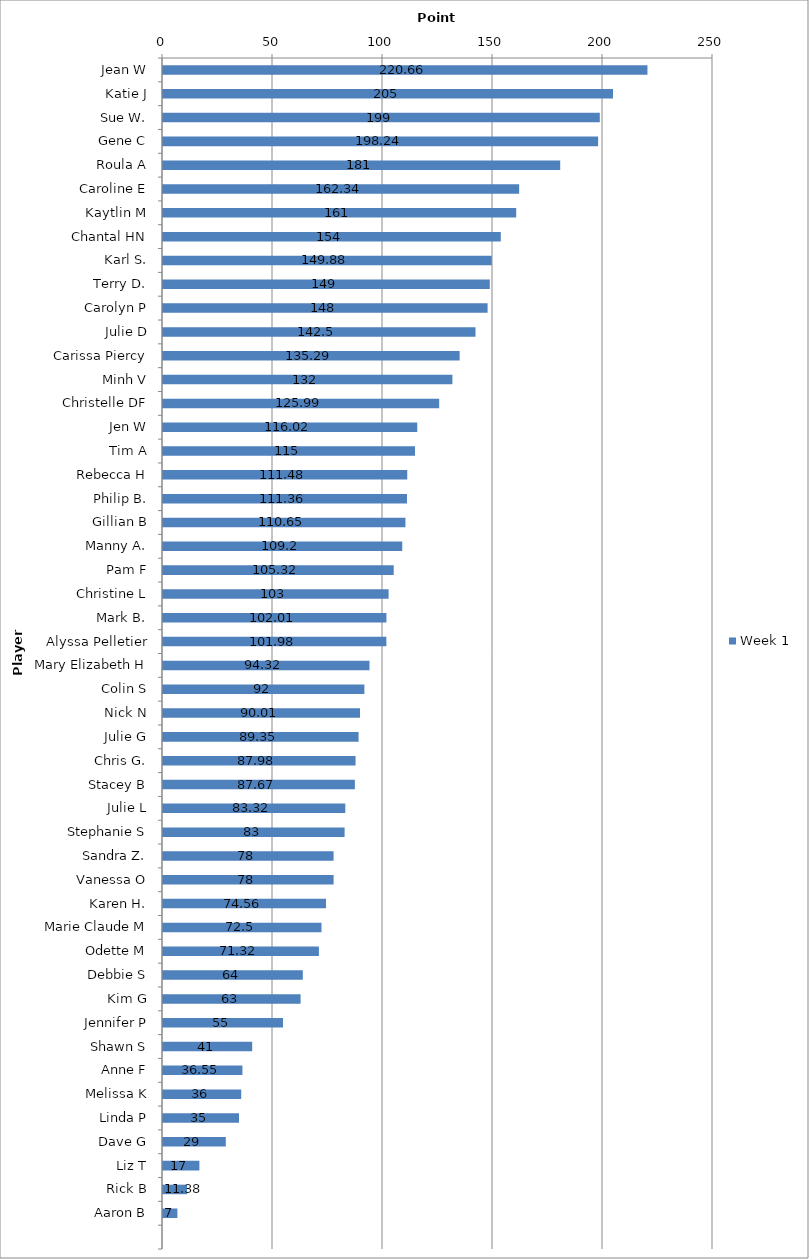
| Category | Week 1 |
|---|---|
| Jean W | 220.66 |
| Katie J | 205 |
| Sue W. | 199 |
| Gene C | 198.24 |
| Roula A | 181 |
| Caroline E | 162.34 |
| Kaytlin M | 161 |
| Chantal HN | 154 |
| Karl S. | 149.88 |
| Terry D. | 149 |
| Carolyn P | 148 |
| Julie D | 142.5 |
| Carissa Piercy | 135.29 |
| Minh V | 132 |
| Christelle DF | 125.99 |
| Jen W | 116.02 |
| Tim A | 115 |
| Rebecca H | 111.48 |
| Philip B. | 111.36 |
| Gillian B | 110.65 |
| Manny A. | 109.2 |
| Pam F | 105.32 |
| Christine L | 103 |
| Mark B. | 102.01 |
| Alyssa Pelletier | 101.98 |
| Mary Elizabeth H | 94.32 |
| Colin S | 92 |
| Nick N | 90.01 |
| Julie G | 89.35 |
| Chris G. | 87.98 |
| Stacey B | 87.67 |
| Julie L | 83.32 |
| Stephanie S | 83 |
| Sandra Z. | 78 |
| Vanessa O | 78 |
| Karen H. | 74.56 |
| Marie Claude M | 72.5 |
| Odette M | 71.32 |
| Debbie S | 64 |
| Kim G | 63 |
| Jennifer P | 55 |
| Shawn S | 41 |
| Anne F | 36.55 |
| Melissa K | 36 |
| Linda P | 35 |
| Dave G | 29 |
| Liz T | 17 |
| Rick B | 11.38 |
| Aaron B | 7 |